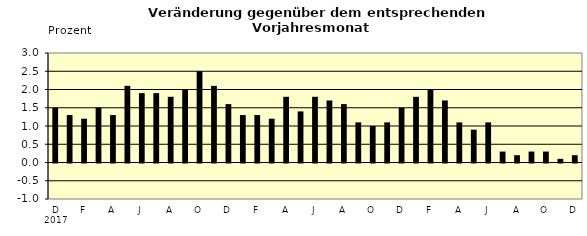
| Category | Series 0 |
|---|---|
| 0 | 1.5 |
| 1 | 1.3 |
| 2 | 1.2 |
| 3 | 1.5 |
| 4 | 1.3 |
| 5 | 2.1 |
| 6 | 1.9 |
| 7 | 1.9 |
| 8 | 1.8 |
| 9 | 2 |
| 10 | 2.5 |
| 11 | 2.1 |
| 12 | 1.6 |
| 13 | 1.3 |
| 14 | 1.3 |
| 15 | 1.2 |
| 16 | 1.8 |
| 17 | 1.4 |
| 18 | 1.8 |
| 19 | 1.7 |
| 20 | 1.6 |
| 21 | 1.1 |
| 22 | 1 |
| 23 | 1.1 |
| 24 | 1.5 |
| 25 | 1.8 |
| 26 | 2 |
| 27 | 1.7 |
| 28 | 1.1 |
| 29 | 0.9 |
| 30 | 1.1 |
| 31 | 0.3 |
| 32 | 0.2 |
| 33 | 0.3 |
| 34 | 0.3 |
| 35 | 0.1 |
| 36 | 0.2 |